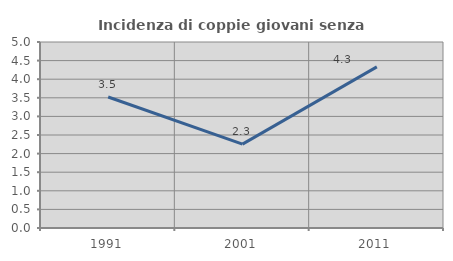
| Category | Incidenza di coppie giovani senza figli |
|---|---|
| 1991.0 | 3.521 |
| 2001.0 | 2.256 |
| 2011.0 | 4.332 |